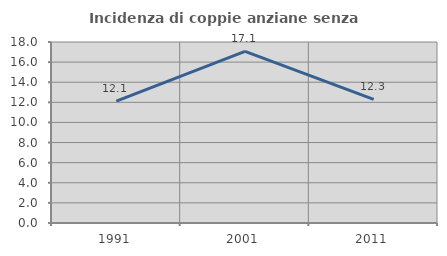
| Category | Incidenza di coppie anziane senza figli  |
|---|---|
| 1991.0 | 12.129 |
| 2001.0 | 17.075 |
| 2011.0 | 12.288 |